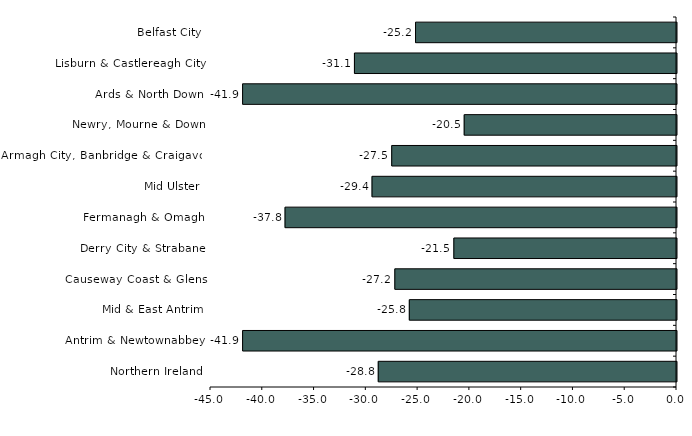
| Category | Series 0 |
|---|---|
| Belfast City | -25.2 |
| Lisburn & Castlereagh City | -31.1 |
| Ards & North Down | -41.9 |
| Newry, Mourne & Down | -20.5 |
| Armagh City, Banbridge & Craigavon | -27.5 |
| Mid Ulster | -29.4 |
| Fermanagh & Omagh | -37.8 |
| Derry City & Strabane | -21.5 |
| Causeway Coast & Glens | -27.2 |
| Mid & East Antrim | -25.8 |
| Antrim & Newtownabbey | -41.9 |
| Northern Ireland | -28.8 |